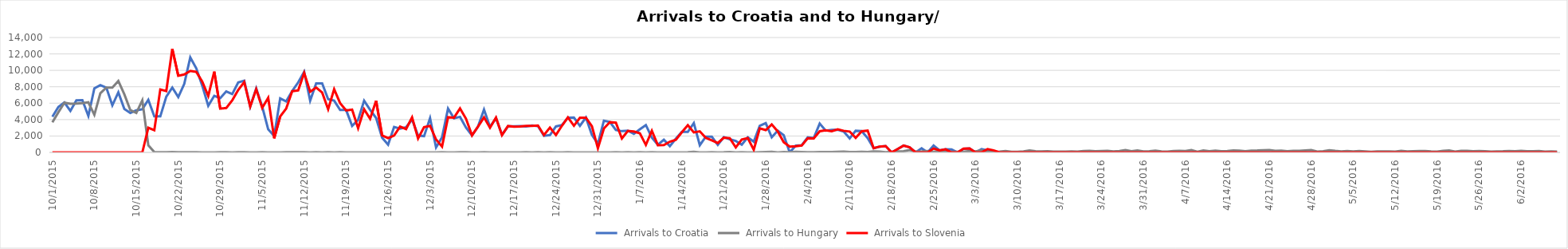
| Category | Arrivals to Croatia | Arrivals to Hungary | Arrivals to Slovenia |
|---|---|---|---|
| 10/1/15 | 4344 | 3667 | 0 |
| 10/2/15 | 5546 | 4897 | 0 |
| 10/3/15 | 6086 | 6056 | 0 |
| 10/4/15 | 5065 | 5925 | 0 |
| 10/5/15 | 6338 | 5952 | 0 |
| 10/6/15 | 6370 | 6000 | 0 |
| 10/7/15 | 4446 | 6103 | 0 |
| 10/8/15 | 7798 | 4583 | 6 |
| 10/9/15 | 8201 | 7215 | 0 |
| 10/10/15 | 7896 | 7907 | 0 |
| 10/11/15 | 5732 | 7897 | 0 |
| 10/12/15 | 7317 | 8702 | 0 |
| 10/13/15 | 5286 | 7081 | 0 |
| 10/14/15 | 4814 | 5157 | 0 |
| 10/15/15 | 5138 | 4808 | 0 |
| 10/16/15 | 5260 | 6353 | 0 |
| 10/17/15 | 6415 | 870 | 3000 |
| 10/18/15 | 4390 | 41 | 2700 |
| 10/19/15 | 4388 | 22 | 7677 |
| 10/20/15 | 6793 | 36 | 7478 |
| 10/21/15 | 7900 | 39 | 12616 |
| 10/22/15 | 6748 | 32 | 9339 |
| 10/23/15 | 8348 | 29 | 9500 |
| 10/24/15 | 11570 | 35 | 9925 |
| 10/25/15 | 10249 | 34 | 9818 |
| 10/26/15 | 8128 | 12 | 8625 |
| 10/27/15 | 5683 | 7 | 6877 |
| 10/28/15 | 6900 | 4 | 9848 |
| 10/29/15 | 6615 | 23 | 5341 |
| 10/30/15 | 7429 | 18 | 5409 |
| 10/31/15 | 7110 | 10 | 6344 |
| 11/1/15 | 8534 | 14 | 7611 |
| 11/2/15 | 8746 | 31 | 8568 |
| 11/3/15 | 5573 | 8 | 5591 |
| 11/4/15 | 7792 | 10 | 7693 |
| 11/5/15 | 5587 | 18 | 5426 |
| 11/6/15 | 2809 | 4 | 6655 |
| 11/7/15 | 2000 | 8 | 1716 |
| 11/8/15 | 6579 | 9 | 4381 |
| 11/9/15 | 6214 | 25 | 5341 |
| 11/10/15 | 7474 | 14 | 7457 |
| 11/11/15 | 8524 | 13 | 7554 |
| 11/12/15 | 9823 | 23 | 9681 |
| 11/13/15 | 6314 | 6 | 7397 |
| 11/14/15 | 8405 | 21 | 7905 |
| 11/15/15 | 8415 | 8 | 7300 |
| 11/16/15 | 6490 | 15 | 5261 |
| 11/17/15 | 6304 | 5 | 7704 |
| 11/18/15 | 5180 | 15 | 5998 |
| 11/19/15 | 5167 | 4 | 5119 |
| 11/20/15 | 3230 | 9 | 5211 |
| 11/21/15 | 3977 | 2 | 2952 |
| 11/22/15 | 6305 | 11 | 5260 |
| 11/23/15 | 5184 | 4 | 4102 |
| 11/24/15 | 4203 | 4 | 6297 |
| 11/25/15 | 1808 | 6 | 2070 |
| 11/26/15 | 952 | 10 | 1742 |
| 11/27/15 | 3095 | 2 | 2065 |
| 11/28/15 | 2886 | 6 | 3139 |
| 11/29/15 | 3060 | 3 | 2843 |
| 11/30/15 | 4009 | 7 | 4274 |
| 12/1/15 | 2066 | 4 | 1709 |
| 12/2/15 | 1982 | 4 | 3077 |
| 12/3/15 | 4174 | 9 | 3237 |
| 12/4/15 | 611 | 1 | 1577 |
| 12/5/15 | 1835 | 31 | 715 |
| 12/6/15 | 5339 | 7 | 4288 |
| 12/7/15 | 4162 | 0 | 4240 |
| 12/8/15 | 4335 | 13 | 5351 |
| 12/9/15 | 3027 | 14 | 4103 |
| 12/10/15 | 2076 | 3 | 2078 |
| 12/11/15 | 3149 | 0 | 3149 |
| 12/12/15 | 5225 | 13 | 4271 |
| 12/13/15 | 3112 | 10 | 3016 |
| 12/14/15 | 4174 | 3 | 4250 |
| 12/15/15 | 2160 | 2 | 2098 |
| 12/16/15 | 3177 | 6 | 3214 |
| 12/17/15 | 3192 | 0 | 3135 |
| 12/18/15 | 3200 | 11 | 3150 |
| 12/19/15 | 3156 | 31 | 3222 |
| 12/20/15 | 3276 | 8 | 3233 |
| 12/21/15 | 3210 | 25 | 3278 |
| 12/22/15 | 2027 | 1 | 2118 |
| 12/23/15 | 2116 | 21 | 3030 |
| 12/24/15 | 3166 | 8 | 2131 |
| 12/25/15 | 3339 | 2 | 3257 |
| 12/26/15 | 4241 | 17 | 4274 |
| 12/27/15 | 4251 | 10 | 3253 |
| 12/28/15 | 3249 | 0 | 4228 |
| 12/29/15 | 4253 | 0 | 4239 |
| 12/30/15 | 2132 | 11 | 3195 |
| 12/31/15 | 1058 | 5 | 511 |
| 1/1/16 | 3869 | 0 | 2914 |
| 1/2/16 | 3710 | 0 | 3690 |
| 1/3/16 | 2732 | 17 | 3619 |
| 1/4/16 | 2591 | 3 | 1708 |
| 1/5/16 | 2650 | 18 | 2626 |
| 1/6/16 | 2273 | 5 | 2550 |
| 1/7/16 | 2814 | 31 | 2337 |
| 1/8/16 | 3332 | 7 | 916 |
| 1/9/16 | 1799 | 15 | 2630 |
| 1/10/16 | 942 | 6 | 880 |
| 1/11/16 | 1549 | 7 | 897 |
| 1/12/16 | 769 | 2 | 1308 |
| 1/13/16 | 1679 | 5 | 1544 |
| 1/14/16 | 2502 | 4 | 2449 |
| 1/15/16 | 2493 | 14 | 3330 |
| 1/16/16 | 3579 | 65 | 2435 |
| 1/17/16 | 878 | 11 | 2570 |
| 1/18/16 | 1930 | 9 | 1783 |
| 1/19/16 | 1917 | 29 | 1476 |
| 1/20/16 | 914 | 10 | 1154 |
| 1/21/16 | 1865 | 13 | 1787 |
| 1/22/16 | 1599 | 47 | 1738 |
| 1/23/16 | 1394 | 10 | 606 |
| 1/24/16 | 946 | 15 | 1564 |
| 1/25/16 | 1847 | 5 | 1746 |
| 1/26/16 | 1309 | 4 | 326 |
| 1/27/16 | 3256 | 36 | 2935 |
| 1/28/16 | 3565 | 51 | 2719 |
| 1/29/16 | 1843 | 69 | 3416 |
| 1/30/16 | 2641 | 6 | 2556 |
| 1/31/16 | 2098 | 39 | 1249 |
| 2/1/16 | 0 | 31 | 716 |
| 2/2/16 | 822 | 69 | 765 |
| 2/3/16 | 881 | 46 | 841 |
| 2/4/16 | 1836 | 31 | 1733 |
| 2/5/16 | 1750 | 19 | 1713 |
| 2/6/16 | 3510 | 49 | 2580 |
| 2/7/16 | 2658 | 53 | 2694 |
| 2/8/16 | 2736 | 48 | 2582 |
| 2/9/16 | 2764 | 72 | 2805 |
| 2/10/16 | 2544 | 104 | 2637 |
| 2/11/16 | 1716 | 54 | 2547 |
| 2/12/16 | 2635 | 39 | 1774 |
| 2/13/16 | 2595 | 66 | 2576 |
| 2/14/16 | 1749 | 51 | 2660 |
| 2/15/16 | 512 | 119 | 516 |
| 2/16/16 | 701 | 93 | 715 |
| 2/17/16 | 769 | 34 | 769 |
| 2/18/16 | 0 | 73 | 0 |
| 2/19/16 | 408 | 113 | 407 |
| 2/20/16 | 834 | 151 | 828 |
| 2/21/16 | 630 | 288 | 623 |
| 2/22/16 | 0 | 103 | 0 |
| 2/23/16 | 507 | 112 | 0 |
| 2/24/16 | 0 | 166 | 0 |
| 2/25/16 | 841 | 76 | 478 |
| 2/26/16 | 250 | 140 | 254 |
| 2/27/16 | 385 | 111 | 382 |
| 2/28/16 | 358 | 62 | 0 |
| 2/29/16 | 0 | 78 | 0 |
| 3/1/16 | 436 | 83 | 466 |
| 3/2/16 | 476 | 181 | 479 |
| 3/3/16 | 0 | 133 | 0 |
| 3/4/16 | 410 | 268 | 0 |
| 3/5/16 | 253 | 89 | 409 |
| 3/6/16 | 0 | 72 | 253 |
| 3/7/16 | 0 | 100 | 0 |
| 3/8/16 | 0 | 167 | 0 |
| 3/9/16 | 0 | 73 | 0 |
| 3/10/16 | 0 | 70 | 0 |
| 3/11/16 | 0 | 133 | 0 |
| 3/12/16 | 0 | 245 | 0 |
| 3/13/16 | 0 | 148 | 0 |
| 3/14/16 | 0 | 123 | 0 |
| 3/15/16 | 0 | 153 | 0 |
| 3/16/16 | 0 | 104 | 0 |
| 3/17/16 | 0 | 102 | 0 |
| 3/18/16 | 0 | 95 | 0 |
| 3/19/16 | 0 | 132 | 0 |
| 3/20/16 | 0 | 107 | 0 |
| 3/21/16 | 0 | 176 | 0 |
| 3/22/16 | 0 | 188 | 0 |
| 3/23/16 | 0 | 137 | 0 |
| 3/24/16 | 0 | 171 | 0 |
| 3/25/16 | 0 | 199 | 0 |
| 3/26/16 | 0 | 125 | 0 |
| 3/27/16 | 0 | 171 | 6 |
| 3/28/16 | 0 | 293 | 0 |
| 3/29/16 | 0 | 154 | 5 |
| 3/30/16 | 0 | 234 | 4 |
| 3/31/16 | 0 | 127 | 0 |
| 4/1/16 | 0 | 142 | 0 |
| 4/2/16 | 0 | 217 | 0 |
| 4/3/16 | 0 | 119 | 0 |
| 4/4/16 | 0 | 99 | 0 |
| 4/5/16 | 0 | 176 | 2 |
| 4/6/16 | 0 | 191 | 0 |
| 4/7/16 | 0 | 178 | 0 |
| 4/8/16 | 0 | 280 | 0 |
| 4/9/16 | 0 | 83 | 0 |
| 4/10/16 | 0 | 230 | 0 |
| 4/11/16 | 0 | 149 | 0 |
| 4/12/16 | 0 | 214 | 0 |
| 4/13/16 | 0 | 150 | 0 |
| 4/14/16 | 0 | 161 | 0 |
| 4/15/16 | 0 | 237 | 0 |
| 4/16/16 | 0 | 210 | 0 |
| 4/17/16 | 0 | 144 | 0 |
| 4/18/16 | 0 | 229 | 0 |
| 4/19/16 | 0 | 235 | 0 |
| 4/20/16 | 0 | 274 | 0 |
| 4/21/16 | 0 | 294 | 0 |
| 4/22/16 | 0 | 195 | 0 |
| 4/23/16 | 0 | 226 | 0 |
| 4/24/16 | 0 | 151 | 0 |
| 4/25/16 | 0 | 202 | 0 |
| 4/26/16 | 0 | 190 | 0 |
| 4/27/16 | 0 | 241 | 0 |
| 4/28/16 | 0 | 284 | 0 |
| 4/29/16 | 0 | 108 | 0 |
| 4/30/16 | 0 | 141 | 0 |
| 5/1/16 | 0 | 274 | 0 |
| 5/2/16 | 0 | 187 | 0 |
| 5/3/16 | 0 | 131 | 0 |
| 5/4/16 | 0 | 169 | 0 |
| 5/5/16 | 0 | 133 | 0 |
| 5/6/16 | 0 | 178 | 0 |
| 5/7/16 | 0 | 132 | 0 |
| 5/8/16 | 0 | 75 | 0 |
| 5/9/16 | 0 | 124 | 0 |
| 5/10/16 | 0 | 128 | 0 |
| 5/11/16 | 0 | 120 | 0 |
| 5/12/16 | 0 | 89 | 0 |
| 5/13/16 | 0 | 201 | 0 |
| 5/14/16 | 0 | 120 | 0 |
| 5/15/16 | 0 | 139 | 0 |
| 5/16/16 | 0 | 169 | 0 |
| 5/17/16 | 0 | 164 | 0 |
| 5/18/16 | 0 | 121 | 0 |
| 5/19/16 | 0 | 100 | 0 |
| 5/20/16 | 0 | 198 | 0 |
| 5/21/16 | 0 | 245 | 0 |
| 5/22/16 | 0 | 108 | 0 |
| 5/23/16 | 0 | 193 | 0 |
| 5/24/16 | 0 | 198 | 0 |
| 5/25/16 | 0 | 139 | 0 |
| 5/26/16 | 0 | 181 | 0 |
| 5/27/16 | 0 | 144 | 0 |
| 5/28/16 | 0 | 92 | 0 |
| 5/29/16 | 0 | 115 | 0 |
| 5/30/16 | 0 | 140 | 0 |
| 5/31/16 | 0 | 182 | 0 |
| 6/1/16 | 0 | 138 | 0 |
| 6/2/16 | 0 | 187 | 0 |
| 6/3/16 | 0 | 146 | 0 |
| 6/4/16 | 0 | 135 | 0 |
| 6/5/16 | 0 | 164 | 0 |
| 6/6/16 | 0 | 100 | 0 |
| 6/7/16 | 0 | 131 | 0 |
| 6/8/16 | 0 | 104 | 0 |